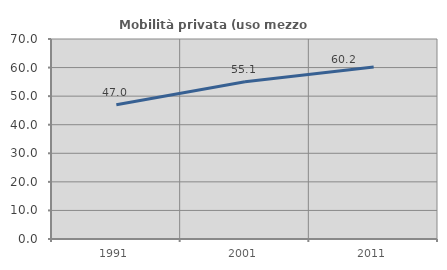
| Category | Mobilità privata (uso mezzo privato) |
|---|---|
| 1991.0 | 46.999 |
| 2001.0 | 55.055 |
| 2011.0 | 60.203 |